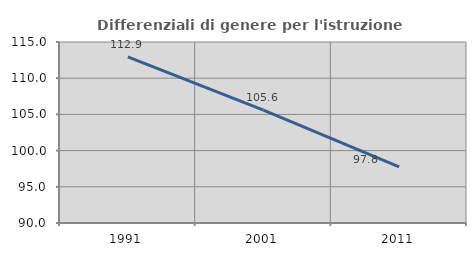
| Category | Differenziali di genere per l'istruzione superiore |
|---|---|
| 1991.0 | 112.948 |
| 2001.0 | 105.584 |
| 2011.0 | 97.762 |